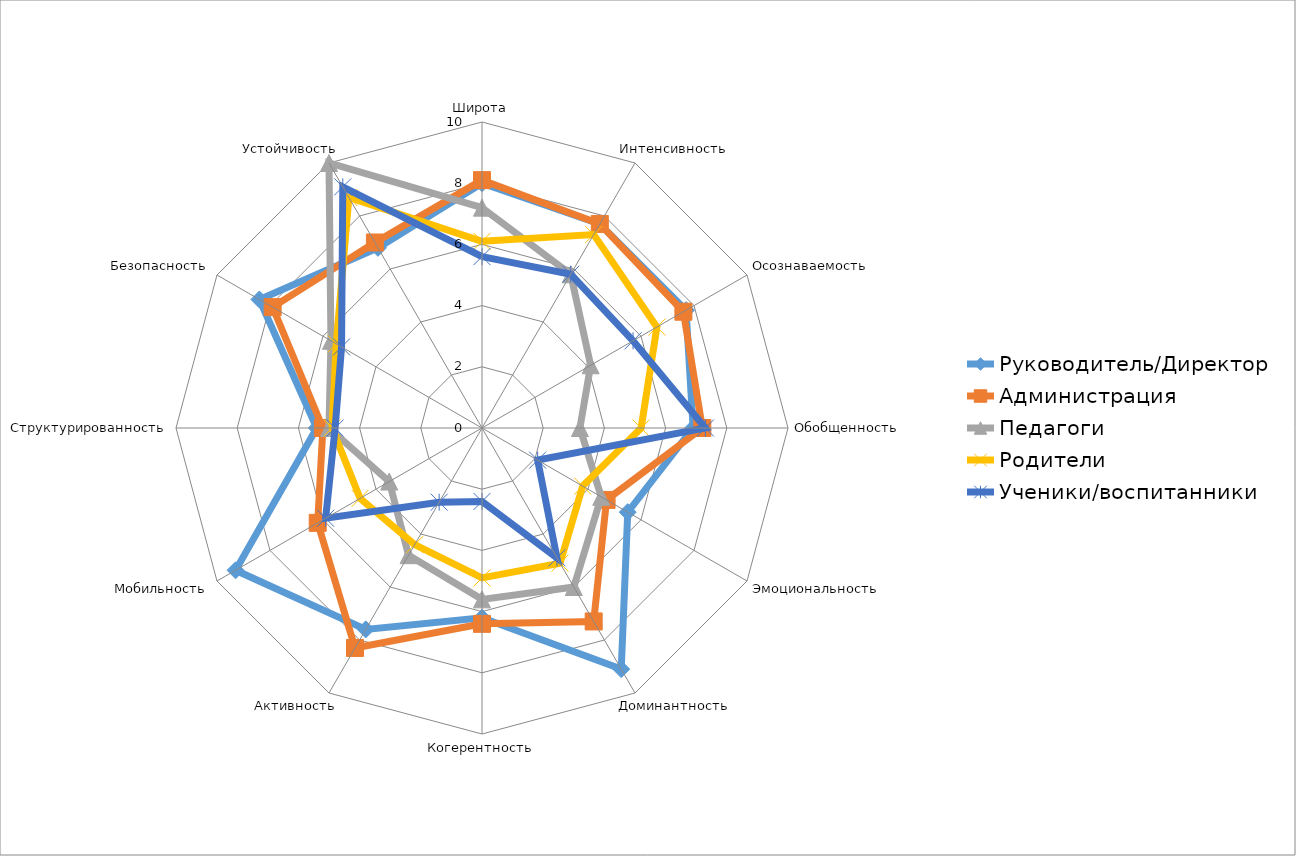
| Category | Руководитель/Директор | Администрация | Педагоги | Родители | Ученики/воспитанники |
|---|---|---|---|---|---|
| Широта | 8 | 8.1 | 7.2 | 6.1 | 5.6 |
| Интенсивность | 7.7 | 7.7 | 5.8 | 7.3 | 5.8 |
| Осознаваемость | 7.7 | 7.6 | 4.1 | 6.6 | 5.7 |
| Обобщенность | 6.9 | 7.2 | 3.2 | 5.2 | 7.3 |
| Эмоциональность | 5.5 | 4.7 | 4.5 | 3.8 | 2.1 |
| Доминантность | 9.1 | 7.3 | 6 | 5.1 | 4.9 |
| Когерентность | 6.2 | 6.4 | 5.6 | 4.9 | 2.4 |
| Активность | 7.6 | 8.3 | 4.8 | 4.4 | 2.8 |
| Мобильность | 9.3 | 6.2 | 3.5 | 4.6 | 5.9 |
| Структурированность | 5.4 | 5.2 | 5 | 4.9 | 4.8 |
| Безопасность | 8.4 | 7.9 | 5.7 | 5.5 | 5.3 |
| Устойчивость | 6.8 | 7 | 10 | 8.7 | 9.1 |